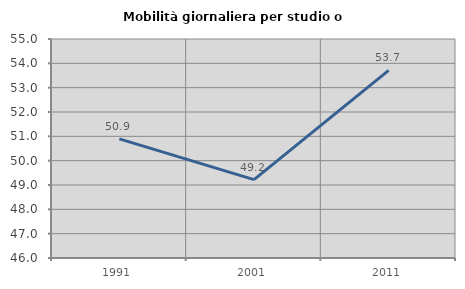
| Category | Mobilità giornaliera per studio o lavoro |
|---|---|
| 1991.0 | 50.896 |
| 2001.0 | 49.218 |
| 2011.0 | 53.708 |